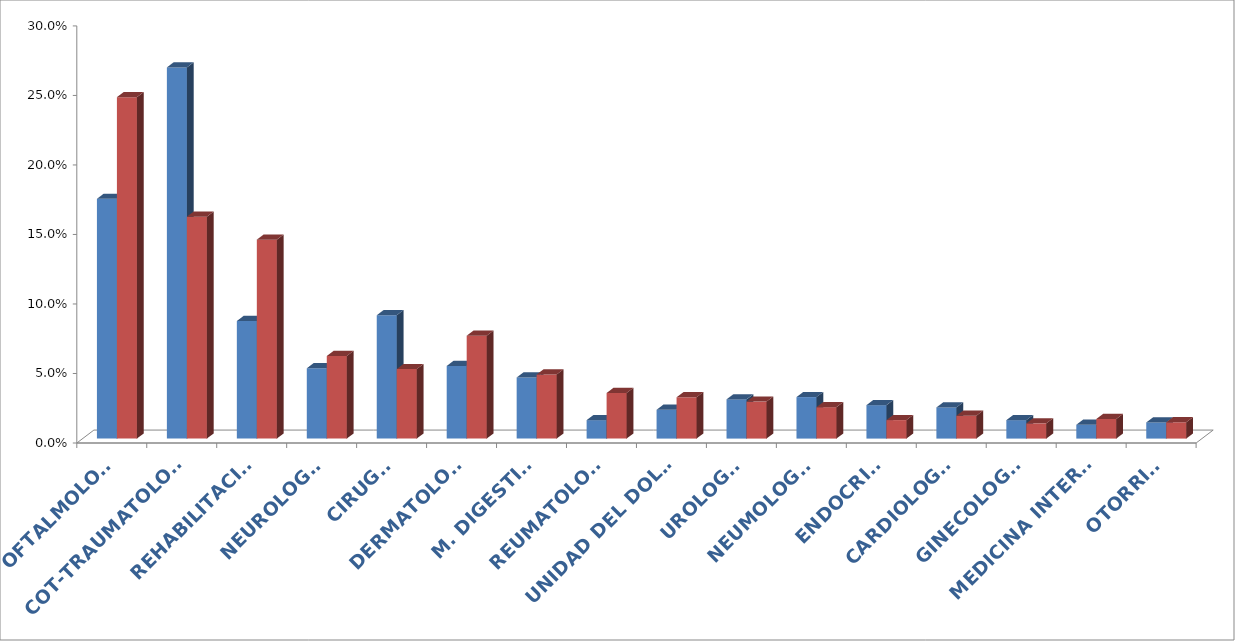
| Category | Series 0 | Series 1 |
|---|---|---|
| OFTALMOLOGIA | 0.172 | 0.246 |
| COT-TRAUMATOLOGIA | 0.267 | 0.16 |
| REHABILITACIÓN | 0.085 | 0.143 |
| NEUROLOGIA | 0.051 | 0.059 |
| CIRUGIA | 0.089 | 0.05 |
| DERMATOLOGIA | 0.052 | 0.074 |
| M. DIGESTIVO | 0.044 | 0.046 |
| REUMATOLOGIA | 0.013 | 0.033 |
| UNIDAD DEL DOLOR | 0.021 | 0.03 |
| UROLOGIA | 0.028 | 0.027 |
| NEUMOLOGIA | 0.03 | 0.023 |
| ENDOCRINO | 0.024 | 0.013 |
| CARDIOLOGÍA | 0.022 | 0.016 |
| GINECOLOGÍA | 0.013 | 0.011 |
| MEDICINA INTERNA | 0.01 | 0.014 |
| OTORRINO | 0.012 | 0.012 |